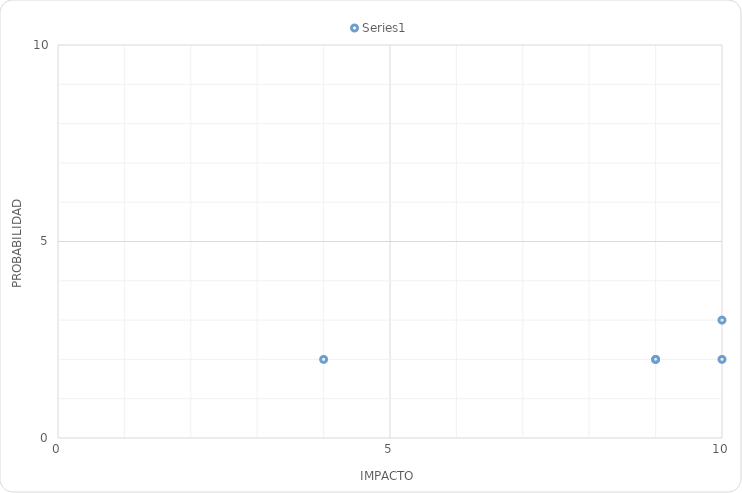
| Category | Series 0 |
|---|---|
| 9.0 | 2 |
| 9.0 | 2 |
| 4.0 | 2 |
| 10.0 | 2 |
| 10.0 | 3 |